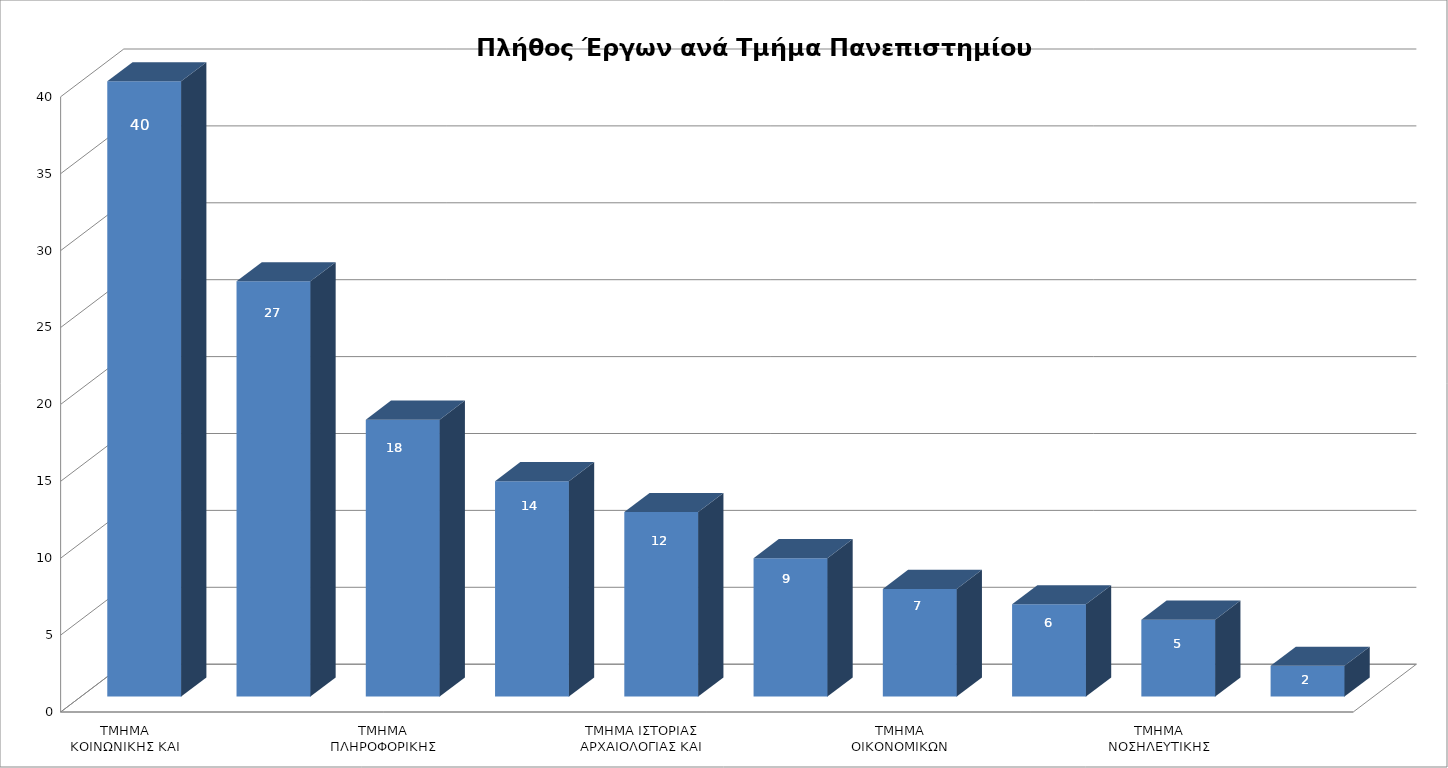
| Category | Series 0 |
|---|---|
| ΤΜΗΜΑ ΚΟΙΝΩΝΙΚΗΣ ΚΑΙ ΕΚΠΑΙΔΕΥΤΙΚΗΣ ΠΟΛΙΤΙΚΗΣ | 40 |
| ΤΜΗΜΑ ΠΟΛΙΤΙΚΗΣ ΕΠΙΣΤΗΜΗΣ ΚΑΙ ΔΙΕΘΝΩΝ ΣΧΕΣΕΩΝ | 27 |
| ΤΜΗΜΑ ΠΛΗΡΟΦΟΡΙΚΗΣ ΚΑΙ ΤΗΛΕΠΙΚΟΙΝΩΝΙΩΝ | 18 |
| ΤΜΗΜΑ ΟΡΓΑΝΩΣΗΣ ΚΑΙ ΔΙΑΧΕΙΡΙΣΗΣ ΑΘΛΗΤΙΣΜΟΥ | 14 |
| ΤΜΗΜΑ ΙΣΤΟΡΙΑΣ ΑΡΧΑΙΟΛΟΓΙΑΣ ΚΑΙ ΔΙΑΧΕΙΡΙΣΗΣ ΠΟΛΙΤΙΣΜΙΚΩΝ ΑΓΑΘΩΝ | 12 |
| ΤΜΗΜΑ ΦΙΛΟΛΟΓΙΑΣ | 9 |
| ΤΜΗΜΑ ΟΙΚΟΝΟΜΙΚΩΝ ΕΠΙΣΤΗΜΩΝ | 7 |
| ΠΑΝΕΠΙΣΤΗΜΙΟ ΠΕΛΟΠΟΝΝΗΣΟΥ | 6 |
| ΤΜΗΜΑ ΝΟΣΗΛΕΥΤΙΚΗΣ | 5 |
| ΤΜΗΜΑ ΘΕΑΤΡΙΚΩΝ ΣΠΟΥΔΩΝ | 2 |